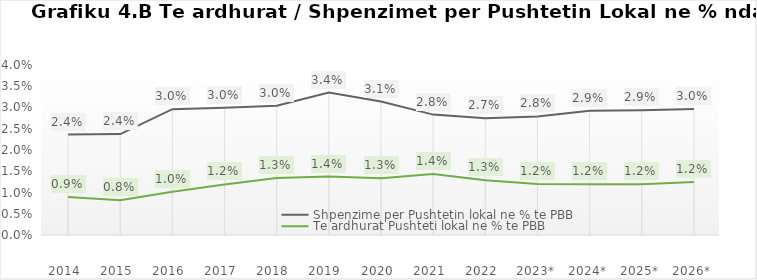
| Category | Shpenzime per Pushtetin lokal ne % te PBB | Te ardhurat Pushteti lokal ne % te PBB |
|---|---|---|
| 2014  | 0.024 | 0.009 |
| 2015  | 0.024 | 0.008 |
| 2016  | 0.03 | 0.01 |
| 2017  | 0.03 | 0.012 |
| 2018  | 0.03 | 0.013 |
| 2019  | 0.034 | 0.014 |
| 2020  | 0.031 | 0.013 |
| 2021  | 0.028 | 0.014 |
| 2022  | 0.027 | 0.013 |
| 2023* | 0.028 | 0.012 |
| 2024* | 0.029 | 0.012 |
| 2025* | 0.029 | 0.012 |
| 2026* | 0.03 | 0.012 |